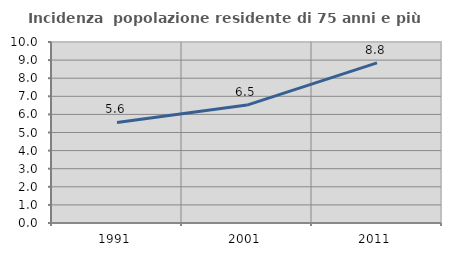
| Category | Incidenza  popolazione residente di 75 anni e più |
|---|---|
| 1991.0 | 5.553 |
| 2001.0 | 6.514 |
| 2011.0 | 8.846 |